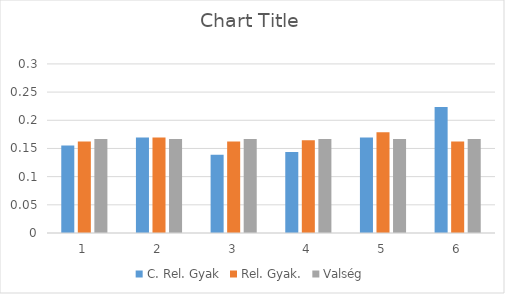
| Category | C. Rel. Gyak | Rel. Gyak. | Valség |
|---|---|---|---|
| 0 | 0.155 | 0.162 | 0.167 |
| 1 | 0.169 | 0.169 | 0.167 |
| 2 | 0.139 | 0.162 | 0.167 |
| 3 | 0.144 | 0.165 | 0.167 |
| 4 | 0.169 | 0.179 | 0.167 |
| 5 | 0.224 | 0.162 | 0.167 |